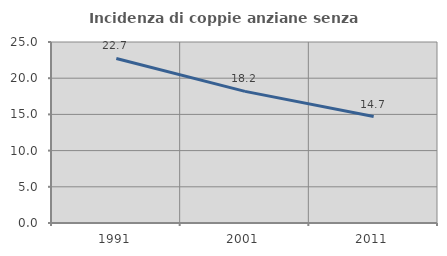
| Category | Incidenza di coppie anziane senza figli  |
|---|---|
| 1991.0 | 22.727 |
| 2001.0 | 18.182 |
| 2011.0 | 14.706 |